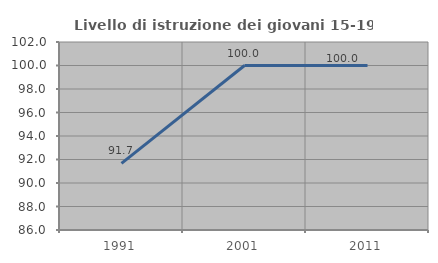
| Category | Livello di istruzione dei giovani 15-19 anni |
|---|---|
| 1991.0 | 91.667 |
| 2001.0 | 100 |
| 2011.0 | 100 |